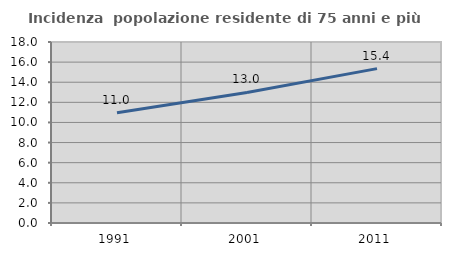
| Category | Incidenza  popolazione residente di 75 anni e più |
|---|---|
| 1991.0 | 10.966 |
| 2001.0 | 12.982 |
| 2011.0 | 15.352 |